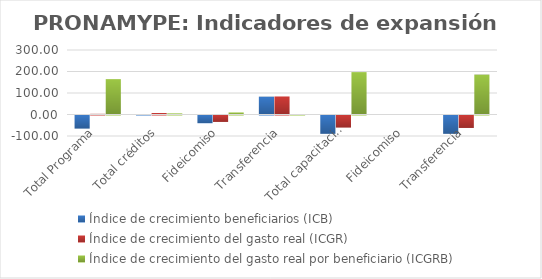
| Category | Índice de crecimiento beneficiarios (ICB)  | Índice de crecimiento del gasto real (ICGR)  | Índice de crecimiento del gasto real por beneficiario (ICGRB)  |
|---|---|---|---|
| Total Programa | -61.012 | 3.117 | 164.487 |
| Total créditos | 1.541 | 6.913 | 5.29 |
| Fideicomiso | -36.056 | -29.971 | 9.517 |
| Transferencia | 82.927 | 83.87 | 0.516 |
| Total capacitación | -85.277 | -56.253 | 197.124 |
| Fideicomiso | 0 | 0 | 0 |
| Transferencia | -85.277 | -57.966 | 185.492 |